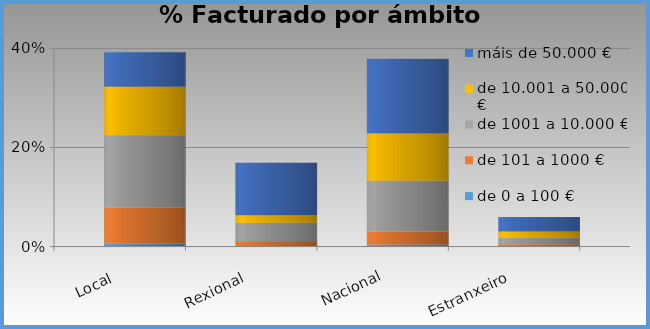
| Category | de 0 a 100 € | de 101 a 1000 € | de 1001 a 10.000 € | de 10.001 a 50.000 € | máis de 50.000 € |
|---|---|---|---|---|---|
| Local | 0.006 | 0.072 | 0.146 | 0.098 | 0.069 |
| Rexional | 0.001 | 0.01 | 0.037 | 0.015 | 0.106 |
| Nacional | 0.004 | 0.026 | 0.103 | 0.095 | 0.15 |
| Estranxeiro | 0 | 0.004 | 0.014 | 0.012 | 0.029 |